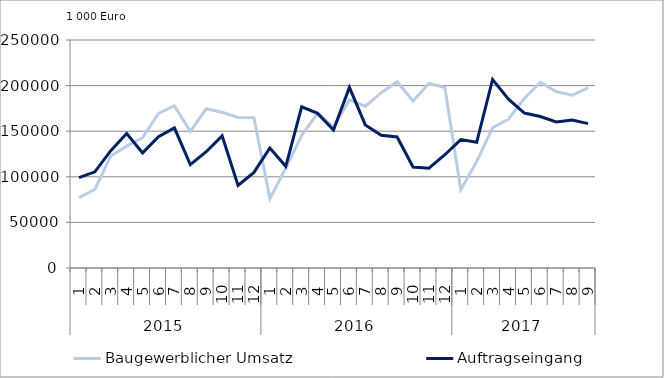
| Category | Baugewerblicher Umsatz | Auftragseingang |
|---|---|---|
| 0 | 77137.228 | 99023.008 |
| 1 | 86257.027 | 105491.844 |
| 2 | 122760.234 | 128704.324 |
| 3 | 133614.814 | 147438.665 |
| 4 | 142869.83 | 126182.175 |
| 5 | 169564.381 | 143879.815 |
| 6 | 177708.819 | 153660.001 |
| 7 | 149762.789 | 113338.261 |
| 8 | 174633.481 | 127520.775 |
| 9 | 170827.145 | 144931.886 |
| 10 | 165122.384 | 90621.16 |
| 11 | 164674.971 | 104795.622 |
| 12 | 76043.538 | 131571.482 |
| 13 | 109483.268 | 111467.248 |
| 14 | 145343.559 | 176673.268 |
| 15 | 169660.551 | 169566.96 |
| 16 | 154554.865 | 151228.165 |
| 17 | 184236.137 | 198035.655 |
| 18 | 177444.278 | 156900.898 |
| 19 | 192230.472 | 145537.167 |
| 20 | 204178.065 | 143616.217 |
| 21 | 183173.849 | 110770.94 |
| 22 | 202302.279 | 109384.188 |
| 23 | 197832.096 | 124193.91 |
| 24 | 85701.947 | 140751.008 |
| 25 | 116743.276 | 137863.383 |
| 26 | 153810.055 | 206710.579 |
| 27 | 163342.989 | 185183.797 |
| 28 | 185946.221 | 169878.51 |
| 29 | 203627.91 | 166148.392 |
| 30 | 193377.256 | 160134.206 |
| 31 | 189429.952 | 162221.206 |
| 32 | 197405.279 | 158305.285 |